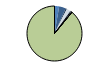
| Category | Series 0 |
|---|---|
| ARRASTRE | 7 |
| CERCO | 10 |
| ATUNEROS CAÑEROS | 2 |
| PALANGRE DE FONDO | 5 |
| PALANGRE DE SUPERFICIE | 2 |
| RASCO | 0 |
| VOLANTA | 2 |
| ARTES FIJAS | 0 |
| ARTES MENORES | 228 |